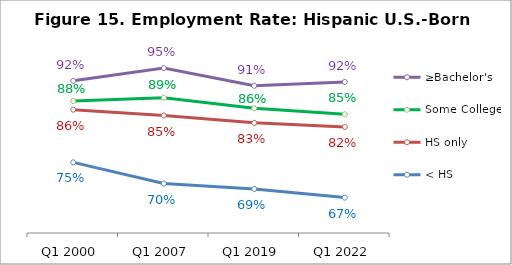
| Category | ≥Bachelor's | Some College | HS only | < HS |
|---|---|---|---|---|
| Q1 2000 | 0.922 | 0.879 | 0.861 | 0.749 |
| Q1 2007 | 0.949 | 0.886 | 0.849 | 0.705 |
| Q1 2019 | 0.912 | 0.864 | 0.833 | 0.693 |
| Q1 2022 | 0.92 | 0.851 | 0.824 | 0.675 |